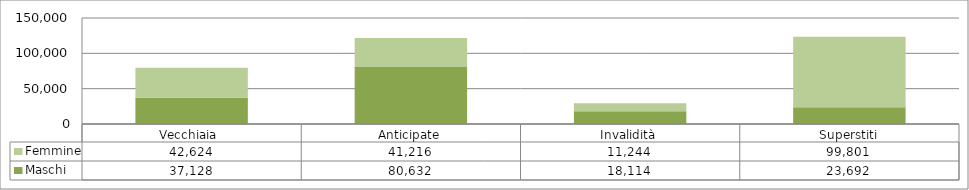
| Category | Maschi | Femmine |
|---|---|---|
| Vecchiaia  | 37128 | 42624 |
| Anticipate | 80632 | 41216 |
| Invalidità | 18114 | 11244 |
| Superstiti | 23692 | 99801 |